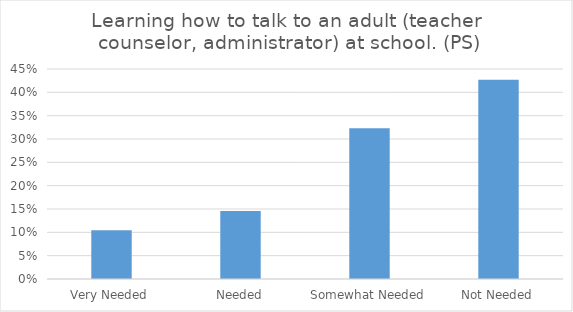
| Category | Learning how to talk to an adult (teacher, counselor, administrator) at school. (PS) |
|---|---|
| Very Needed | 0.104 |
| Needed | 0.146 |
| Somewhat Needed | 0.323 |
| Not Needed | 0.427 |